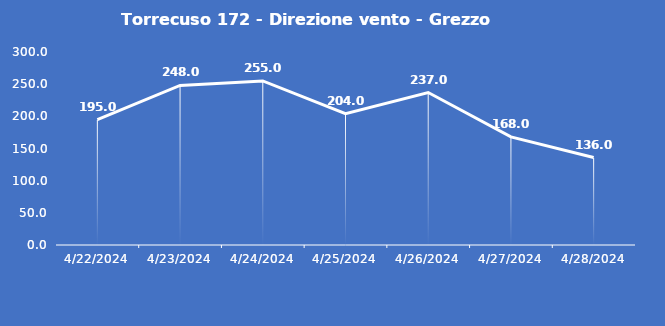
| Category | Torrecuso 172 - Direzione vento - Grezzo (°N) |
|---|---|
| 4/22/24 | 195 |
| 4/23/24 | 248 |
| 4/24/24 | 255 |
| 4/25/24 | 204 |
| 4/26/24 | 237 |
| 4/27/24 | 168 |
| 4/28/24 | 136 |